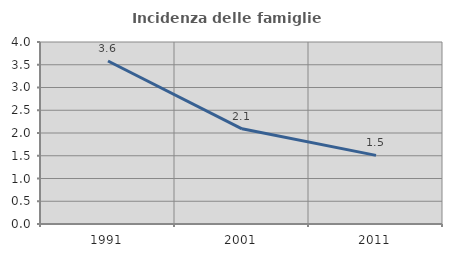
| Category | Incidenza delle famiglie numerose |
|---|---|
| 1991.0 | 3.583 |
| 2001.0 | 2.091 |
| 2011.0 | 1.509 |